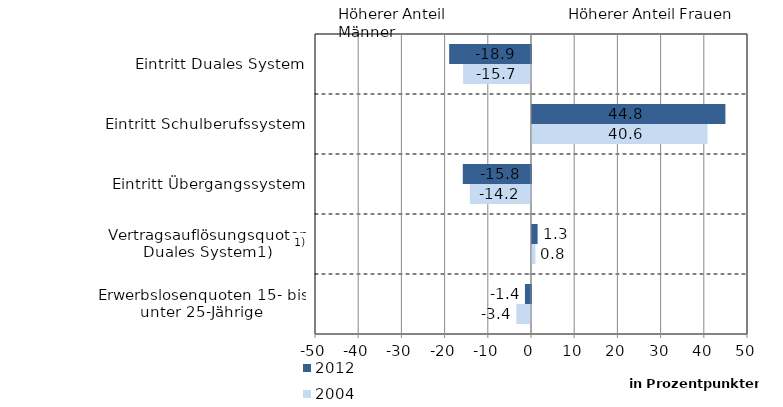
| Category | 2004 | 2012 |
|---|---|---|
| Erwerbslosenquoten 15- bis unter 25-Jährige | -3.4 | -1.4 |
| Vertragsauflösungsquoten Duales System1) | 0.8 | 1.3 |
| Eintritt Übergangssystem | -14.16 | -15.79 |
| Eintritt Schulberufssystem | 40.63 | 44.77 |
| Eintritt Duales System | -15.72 | -18.94 |